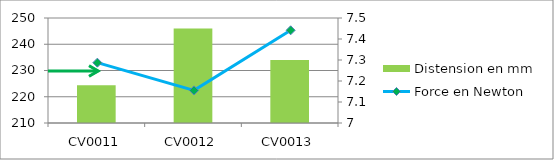
| Category | Distension en mm |
|---|---|
| CV0011 | 7.18 |
| CV0012 | 7.45 |
| CV0013 | 7.3 |